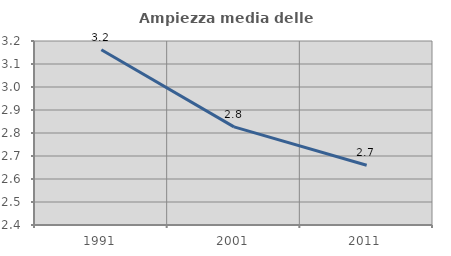
| Category | Ampiezza media delle famiglie |
|---|---|
| 1991.0 | 3.162 |
| 2001.0 | 2.827 |
| 2011.0 | 2.66 |